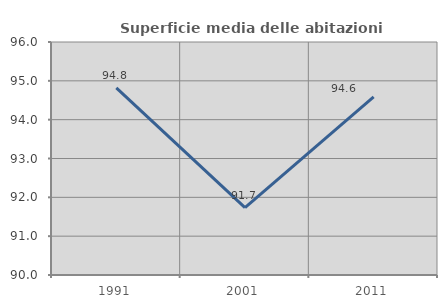
| Category | Superficie media delle abitazioni occupate |
|---|---|
| 1991.0 | 94.82 |
| 2001.0 | 91.734 |
| 2011.0 | 94.587 |